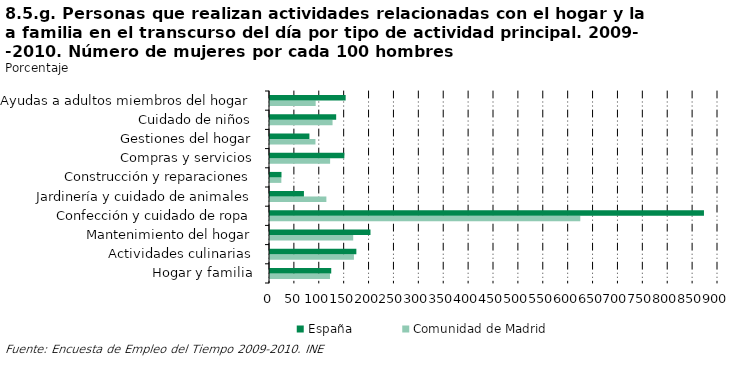
| Category | Comunidad de Madrid | España |
|---|---|---|
| Hogar y familia | 120.494 | 123.025 |
| Actividades culinarias | 168.577 | 173.491 |
| Mantenimiento del hogar | 167.185 | 201.887 |
| Confección y cuidado de ropa | 623.355 | 871.795 |
| Jardinería y cuidado de animales | 113.259 | 68.153 |
| Construcción y reparaciones | 22.808 | 23.077 |
| Compras y servicios | 120.773 | 149.367 |
| Gestiones del hogar | 91.307 | 79.167 |
| Cuidado de niños | 125.675 | 132.934 |
| Ayudas a adultos miembros del hogar | 91.76 | 152 |